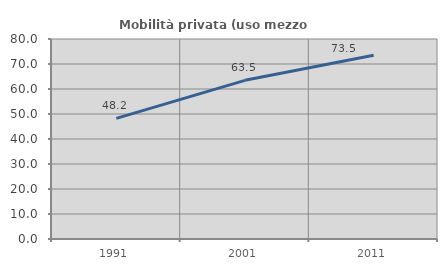
| Category | Mobilità privata (uso mezzo privato) |
|---|---|
| 1991.0 | 48.227 |
| 2001.0 | 63.469 |
| 2011.0 | 73.529 |